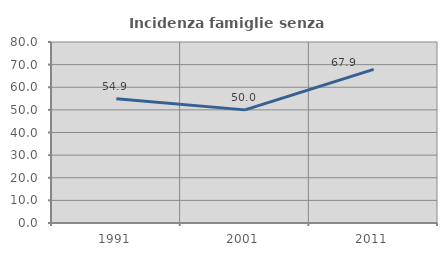
| Category | Incidenza famiglie senza nuclei |
|---|---|
| 1991.0 | 54.867 |
| 2001.0 | 50 |
| 2011.0 | 67.925 |